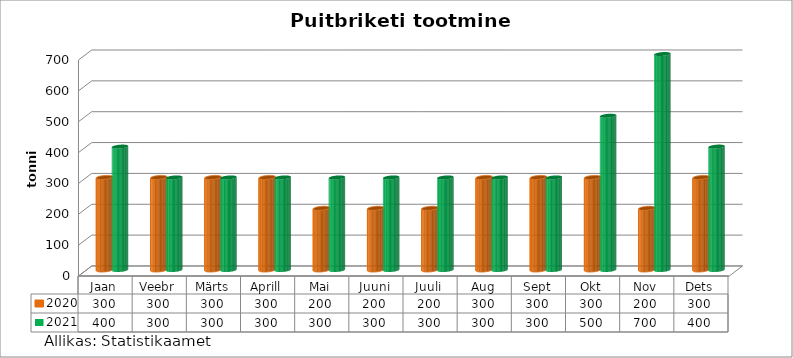
| Category | 2020 | 2021 |
|---|---|---|
| Jaan | 300 | 400 |
| Veebr | 300 | 300 |
| Märts | 300 | 300 |
| Aprill | 300 | 300 |
| Mai | 200 | 300 |
| Juuni | 200 | 300 |
| Juuli | 200 | 300 |
| Aug | 300 | 300 |
| Sept | 300 | 300 |
| Okt | 300 | 500 |
| Nov | 200 | 700 |
| Dets | 300 | 400 |